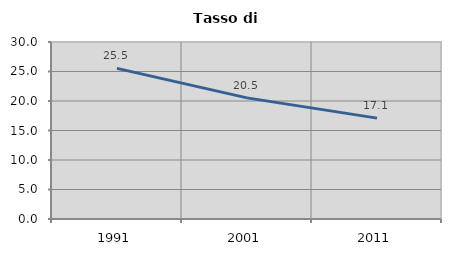
| Category | Tasso di disoccupazione   |
|---|---|
| 1991.0 | 25.528 |
| 2001.0 | 20.532 |
| 2011.0 | 17.1 |